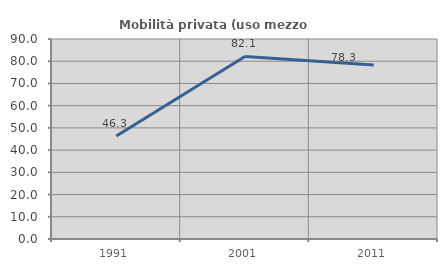
| Category | Mobilità privata (uso mezzo privato) |
|---|---|
| 1991.0 | 46.341 |
| 2001.0 | 82.143 |
| 2011.0 | 78.313 |